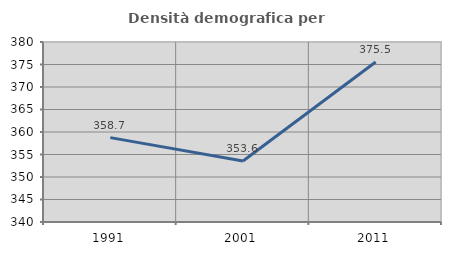
| Category | Densità demografica |
|---|---|
| 1991.0 | 358.746 |
| 2001.0 | 353.573 |
| 2011.0 | 375.544 |